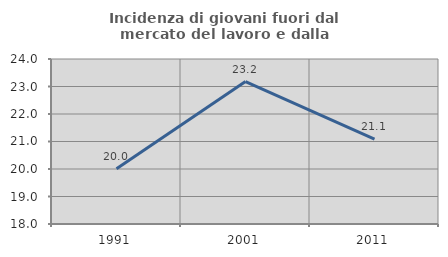
| Category | Incidenza di giovani fuori dal mercato del lavoro e dalla formazione  |
|---|---|
| 1991.0 | 20.006 |
| 2001.0 | 23.18 |
| 2011.0 | 21.085 |